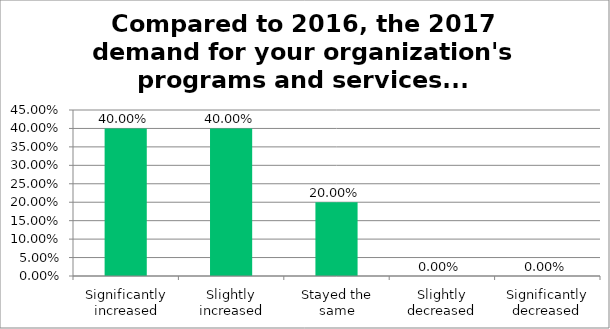
| Category | Responses |
|---|---|
| Significantly increased | 0.4 |
| Slightly increased | 0.4 |
| Stayed the same | 0.2 |
| Slightly decreased | 0 |
| Significantly decreased | 0 |